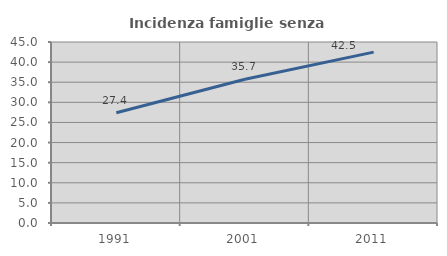
| Category | Incidenza famiglie senza nuclei |
|---|---|
| 1991.0 | 27.404 |
| 2001.0 | 35.749 |
| 2011.0 | 42.482 |